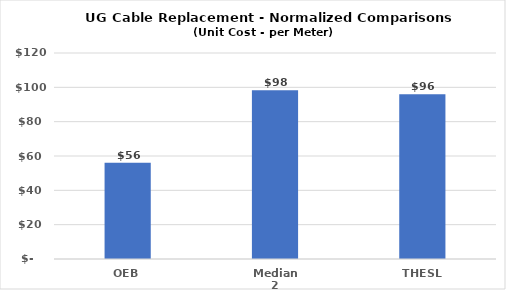
| Category | Series 0 |
|---|---|
| OEB | 56 |
| Median 2 | 98.342 |
| THESL | 96 |